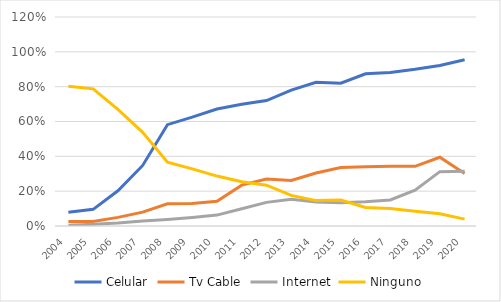
| Category | Celular | Tv Cable | Internet | Ninguno |
|---|---|---|---|---|
| 2004.0 | 0.08 | 0.026 | 0.004 | 0.802 |
| 2005.0 | 0.096 | 0.025 | 0.011 | 0.788 |
| 2006.0 | 0.202 | 0.049 | 0.017 | 0.669 |
| 2007.0 | 0.348 | 0.08 | 0.028 | 0.538 |
| 2008.0 | 0.582 | 0.128 | 0.038 | 0.366 |
| 2009.0 | 0.625 | 0.129 | 0.049 | 0.328 |
| 2010.0 | 0.672 | 0.142 | 0.063 | 0.287 |
| 2011.0 | 0.699 | 0.235 | 0.099 | 0.254 |
| 2012.0 | 0.72 | 0.27 | 0.136 | 0.234 |
| 2013.0 | 0.78 | 0.261 | 0.153 | 0.176 |
| 2014.0 | 0.825 | 0.304 | 0.138 | 0.146 |
| 2015.0 | 0.82 | 0.335 | 0.133 | 0.149 |
| 2016.0 | 0.874 | 0.341 | 0.139 | 0.107 |
| 2017.0 | 0.882 | 0.343 | 0.149 | 0.1 |
| 2018.0 | 0.9 | 0.343 | 0.206 | 0.085 |
| 2019.0 | 0.922 | 0.395 | 0.312 | 0.071 |
| 2020.0 | 0.955 | 0.302 | 0.314 | 0.039 |